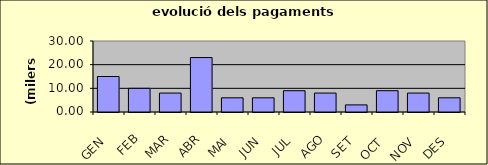
| Category | Series 0 |
|---|---|
| GEN | 15 |
| FEB | 10 |
| MAR | 8 |
| ABR | 23 |
| MAI | 6 |
| JUN | 6 |
| JUL | 9 |
| AGO | 8 |
| SET | 3 |
| OCT | 9 |
| NOV | 8 |
| DES | 6 |